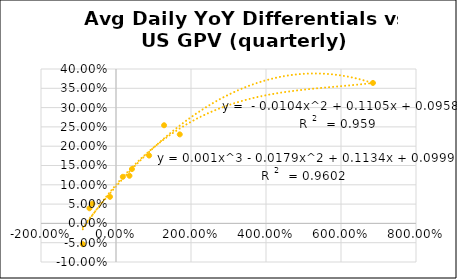
| Category | Series 0 |
|---|---|
| 0.182258118767073 | 0.121 |
| 0.35915370629323756 | 0.123 |
| 0.8835938768873242 | 0.176 |
| 1.2821123747211711 | 0.254 |
| 1.7002026948728959 | 0.231 |
| 6.8522391004789815 | 0.364 |
| 0.42496204218345973 | 0.141 |
| -0.6328080472438434 | 0.051 |
| -0.70777259914242 | 0.039 |
| -0.8843236477116111 | -0.054 |
| -0.1603136060088026 | 0.069 |